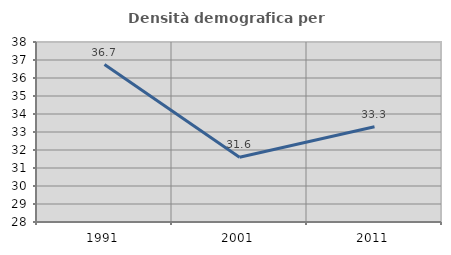
| Category | Densità demografica |
|---|---|
| 1991.0 | 36.749 |
| 2001.0 | 31.596 |
| 2011.0 | 33.295 |